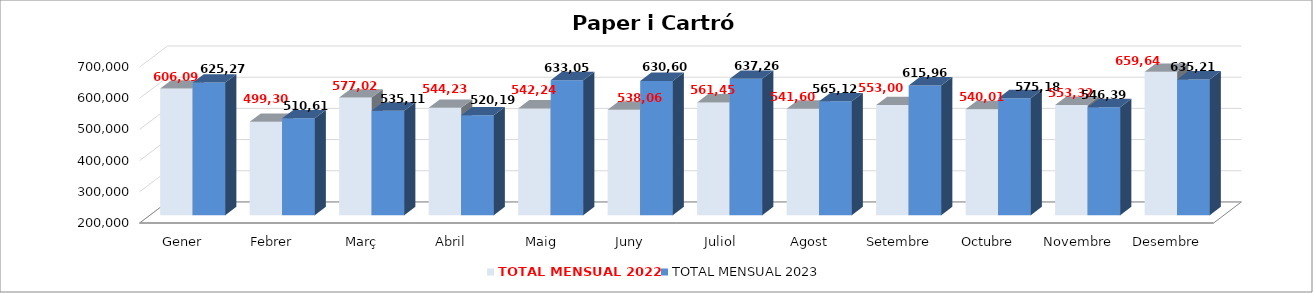
| Category | TOTAL MENSUAL 2022 | TOTAL MENSUAL 2023 |
|---|---|---|
| Gener | 606094.2 | 625276.7 |
| Febrer | 499302.4 | 510618.6 |
| Març | 577027.8 | 535114.8 |
| Abril | 544231.408 | 520198.177 |
| Maig | 542247.222 | 633049.6 |
| Juny | 538066.8 | 630606.5 |
| Juliol | 561457.2 | 637260.3 |
| Agost | 541601.063 | 565122.9 |
| Setembre | 553007.051 | 615964.4 |
| Octubre | 540016.985 | 575183.8 |
| Novembre | 553328.508 | 546391 |
| Desembre | 659641.971 | 635211.55 |